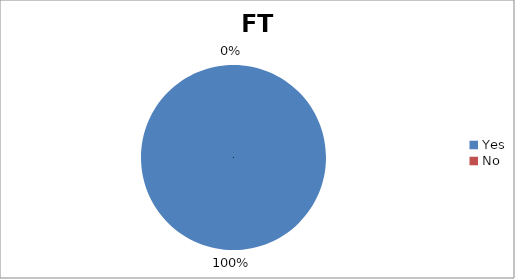
| Category | FT Resident |
|---|---|
| Yes | 15 |
| No | 0 |